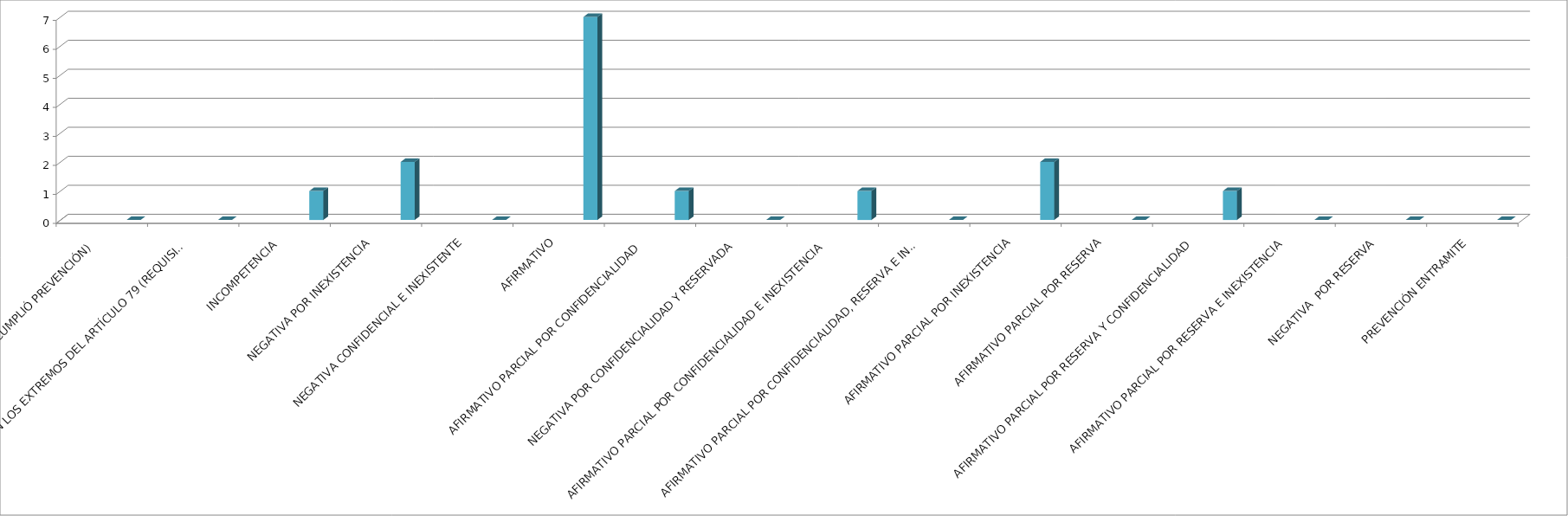
| Category | Series 0 | Series 1 | Series 2 | Series 3 | Series 4 |
|---|---|---|---|---|---|
| SE TIENE POR NO PRESENTADA ( NO CUMPLIÓ PREVENCIÓN) |  |  |  |  | 0 |
| NO CUMPLIO CON LOS EXTREMOS DEL ARTÍCULO 79 (REQUISITOS) |  |  |  |  | 0 |
| INCOMPETENCIA  |  |  |  |  | 1 |
| NEGATIVA POR INEXISTENCIA |  |  |  |  | 2 |
| NEGATIVA CONFIDENCIAL E INEXISTENTE |  |  |  |  | 0 |
| AFIRMATIVO |  |  |  |  | 7 |
| AFIRMATIVO PARCIAL POR CONFIDENCIALIDAD  |  |  |  |  | 1 |
| NEGATIVA POR CONFIDENCIALIDAD Y RESERVADA |  |  |  |  | 0 |
| AFIRMATIVO PARCIAL POR CONFIDENCIALIDAD E INEXISTENCIA |  |  |  |  | 1 |
| AFIRMATIVO PARCIAL POR CONFIDENCIALIDAD, RESERVA E INEXISTENCIA |  |  |  |  | 0 |
| AFIRMATIVO PARCIAL POR INEXISTENCIA |  |  |  |  | 2 |
| AFIRMATIVO PARCIAL POR RESERVA |  |  |  |  | 0 |
| AFIRMATIVO PARCIAL POR RESERVA Y CONFIDENCIALIDAD |  |  |  |  | 1 |
| AFIRMATIVO PARCIAL POR RESERVA E INEXISTENCIA |  |  |  |  | 0 |
| NEGATIVA  POR RESERVA |  |  |  |  | 0 |
| PREVENCIÓN ENTRAMITE |  |  |  |  | 0 |